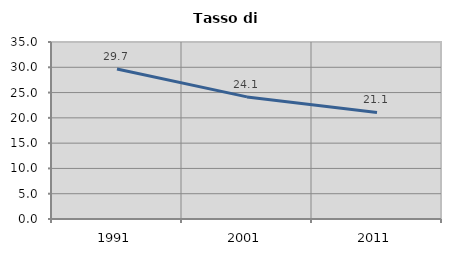
| Category | Tasso di disoccupazione   |
|---|---|
| 1991.0 | 29.675 |
| 2001.0 | 24.146 |
| 2011.0 | 21.08 |